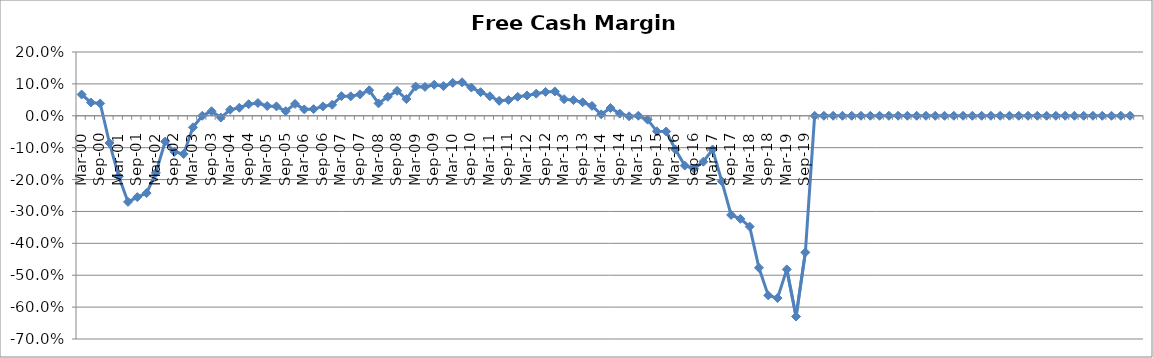
| Category | Revenue ($Millions) |
|---|---|
| Mar-00 | 0.067 |
| Jun-00 | 0.042 |
| Sep-00 | 0.039 |
| Dec-00 | -0.085 |
| Mar-01 | -0.191 |
| Jun-01 | -0.27 |
| Sep-01 | -0.255 |
| Dec-01 | -0.242 |
| Mar-02 | -0.179 |
| Jun-02 | -0.081 |
| Sep-02 | -0.113 |
| Dec-02 | -0.12 |
| Mar-03 | -0.036 |
| Jun-03 | 0 |
| Sep-03 | 0.014 |
| Dec-03 | -0.006 |
| Mar-04 | 0.019 |
| Jun-04 | 0.025 |
| Sep-04 | 0.036 |
| Dec-04 | 0.04 |
| Mar-05 | 0.031 |
| Jun-05 | 0.029 |
| Sep-05 | 0.014 |
| Dec-05 | 0.037 |
| Mar-06 | 0.02 |
| Jun-06 | 0.021 |
| Sep-06 | 0.029 |
| Dec-06 | 0.034 |
| Mar-07 | 0.062 |
| Jun-07 | 0.061 |
| Sep-07 | 0.067 |
| Dec-07 | 0.08 |
| Mar-08 | 0.039 |
| Jun-08 | 0.059 |
| Sep-08 | 0.078 |
| Dec-08 | 0.052 |
| Mar-09 | 0.092 |
| Jun-09 | 0.091 |
| Sep-09 | 0.097 |
| Dec-09 | 0.093 |
| Mar-10 | 0.103 |
| Jun-10 | 0.105 |
| Sep-10 | 0.088 |
| Dec-10 | 0.074 |
| Mar-11 | 0.061 |
| Jun-11 | 0.047 |
| Sep-11 | 0.049 |
| Dec-11 | 0.06 |
| Mar-12 | 0.064 |
| Jun-12 | 0.069 |
| Sep-12 | 0.075 |
| Dec-12 | 0.076 |
| Mar-13 | 0.052 |
| Jun-13 | 0.049 |
| Sep-13 | 0.042 |
| Dec-13 | 0.031 |
| Mar-14 | 0.005 |
| Jun-14 | 0.024 |
| Sep-14 | 0.007 |
| Dec-14 | -0.002 |
| Mar-15 | 0 |
| Jun-15 | -0.012 |
| Sep-15 | -0.049 |
| Dec-15 | -0.049 |
| Mar-16 | -0.106 |
| Jun-16 | -0.156 |
| Sep-16 | -0.166 |
| Dec-16 | -0.144 |
| Mar-17 | -0.106 |
| Jun-17 | -0.206 |
| Sep-17 | -0.311 |
| Dec-17 | -0.323 |
| Mar-18 | -0.348 |
| Jun-18 | -0.477 |
| Sep-18 | -0.563 |
| Dec-18 | -0.572 |
| Mar-19 | -0.482 |
| Jun-19 | -0.63 |
| Sep-19 | -0.428 |